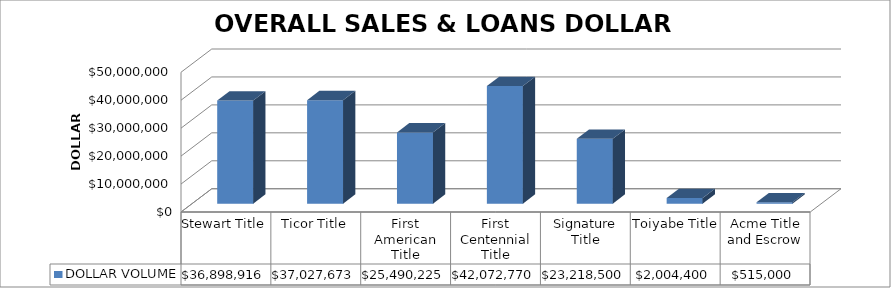
| Category | DOLLAR VOLUME |
|---|---|
| Stewart Title | 36898916 |
| Ticor Title | 37027673 |
| First American Title | 25490225 |
| First Centennial Title | 42072770 |
| Signature Title | 23218500 |
| Toiyabe Title | 2004400 |
| Acme Title and Escrow | 515000 |